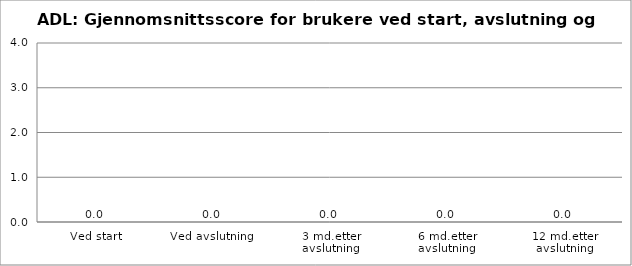
| Category | Series 0 |
|---|---|
| Ved start | 0 |
| Ved avslutning | 0 |
| 3 md.etter avslutning | 0 |
| 6 md.etter avslutning | 0 |
| 12 md.etter avslutning | 0 |